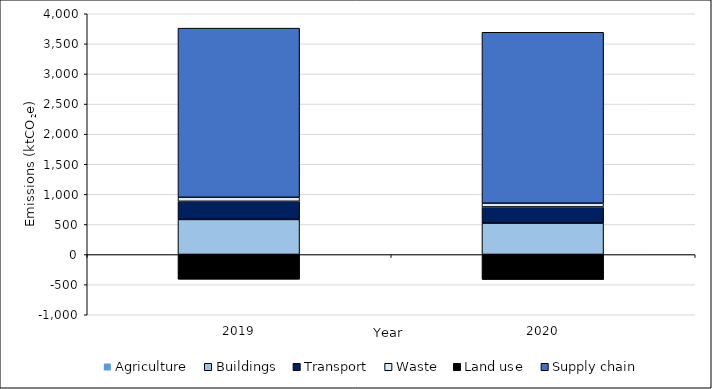
| Category | Agriculture | Buildings | Transport | Waste | Land use | Supply chain |
|---|---|---|---|---|---|---|
| 2019.0 | 2.1 | 581.4 | 301.1 | 66.8 | -408.4 | 2809.7 |
| 2020.0 | 2.1 | 520.9 | 268.1 | 61.9 | -413.2 | 2839.3 |